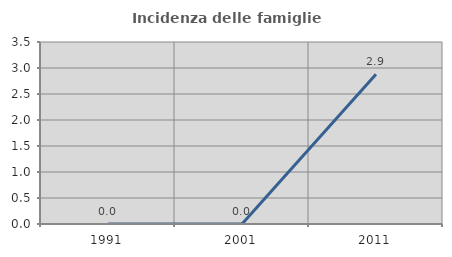
| Category | Incidenza delle famiglie numerose |
|---|---|
| 1991.0 | 0 |
| 2001.0 | 0 |
| 2011.0 | 2.878 |